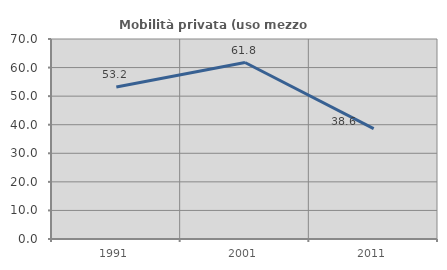
| Category | Mobilità privata (uso mezzo privato) |
|---|---|
| 1991.0 | 53.191 |
| 2001.0 | 61.765 |
| 2011.0 | 38.636 |